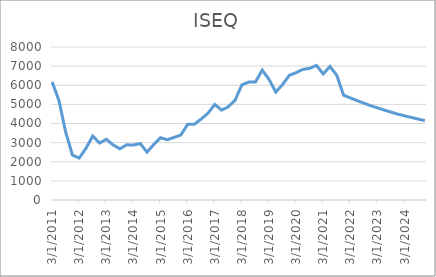
| Category | ISEQ | GDP |
|---|---|---|
| 3/31/11 | 6177.05 |  |
| 6/30/11 | 5209.57 |  |
| 9/30/11 | 3550.63 |  |
| 12/31/11 | 2343.27 |  |
| 3/31/12 | 2193.95 |  |
| 6/30/12 | 2706.08 |  |
| 9/30/12 | 3347.33 |  |
| 12/31/12 | 2974.93 |  |
| 3/31/13 | 3177.77 |  |
| 6/30/13 | 2878.67 |  |
| 9/30/13 | 2676.18 |  |
| 12/31/13 | 2885.1 |  |
| 3/31/14 | 2874.71 |  |
| 6/30/14 | 2953.29 |  |
| 9/30/14 | 2503.19 |  |
| 12/31/14 | 2901.82 |  |
| 3/31/15 | 3254.81 |  |
| 6/30/15 | 3148.62 |  |
| 9/30/15 | 3278.28 |  |
| 12/31/15 | 3396.67 |  |
| 3/31/16 | 3958.27 |  |
| 6/30/16 | 3963.33 |  |
| 9/30/16 | 4238.28 |  |
| 12/31/16 | 4539.43 |  |
| 3/31/17 | 4995.39 |  |
| 6/30/17 | 4699.94 |  |
| 9/30/17 | 4874.68 |  |
| 12/31/17 | 5224.56 |  |
| 3/31/18 | 6019.49 |  |
| 6/30/18 | 6165.04 |  |
| 9/30/18 | 6167.41 |  |
| 12/31/18 | 6791.68 |  |
| 3/31/19 | 6308.92 |  |
| 6/30/19 | 5642.49 |  |
| 9/30/19 | 6034.83 |  |
| 12/31/19 | 6517.24 |  |
| 3/31/20 | 6658.58 |  |
| 6/30/20 | 6827.62 |  |
| 9/30/20 | 6881.75 |  |
| 12/31/20 | 7038.28 |  |
| 3/31/21 | 6593.65 |  |
| 6/30/21 | 6982.83 |  |
| 9/30/21 | 6522.36 |  |
| 12/31/21 | 5479.81 |  |
| 3/31/22 | 5337.356 |  |
| 6/30/22 | 5198.604 |  |
| 9/30/22 | 5063.46 |  |
| 12/31/22 | 4931.829 |  |
| 3/31/23 | 4816.908 |  |
| 6/30/23 | 4704.665 |  |
| 9/30/23 | 4595.037 |  |
| 12/31/23 | 4487.964 |  |
| 3/31/24 | 4401.339 |  |
| 6/30/24 | 4316.386 |  |
| 9/30/24 | 4233.072 |  |
| 12/31/24 | 4151.367 |  |